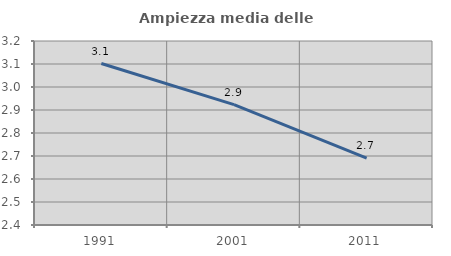
| Category | Ampiezza media delle famiglie |
|---|---|
| 1991.0 | 3.102 |
| 2001.0 | 2.923 |
| 2011.0 | 2.691 |